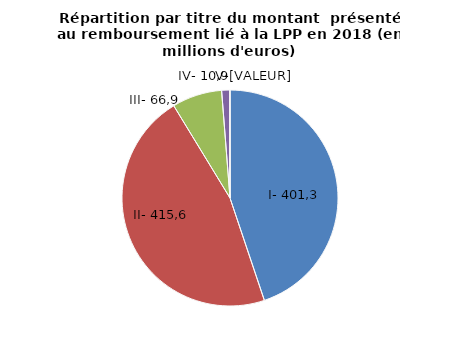
| Category | Montant présenté au rembour-
sement |
|---|---|
| I- Maintien à domicile | 401.3 |
| II- Orthèses, appareils de soutien et prothèses externes | 415.6 |
| III- Produits implantables (en sus des soins en établissements) | 66.9 |
| IV- Achats et réparations des fauteuils roulants | 10.9 |